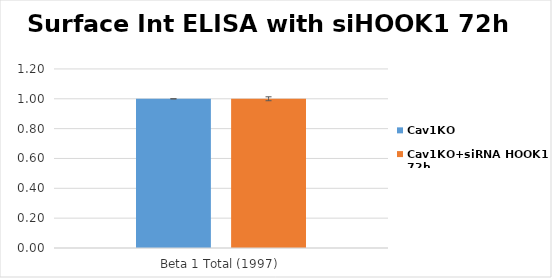
| Category | Cav1KO | Cav1KO+siRNA HOOK1 72h |
|---|---|---|
| Beta 1 Total (1997) | 1 | 1 |